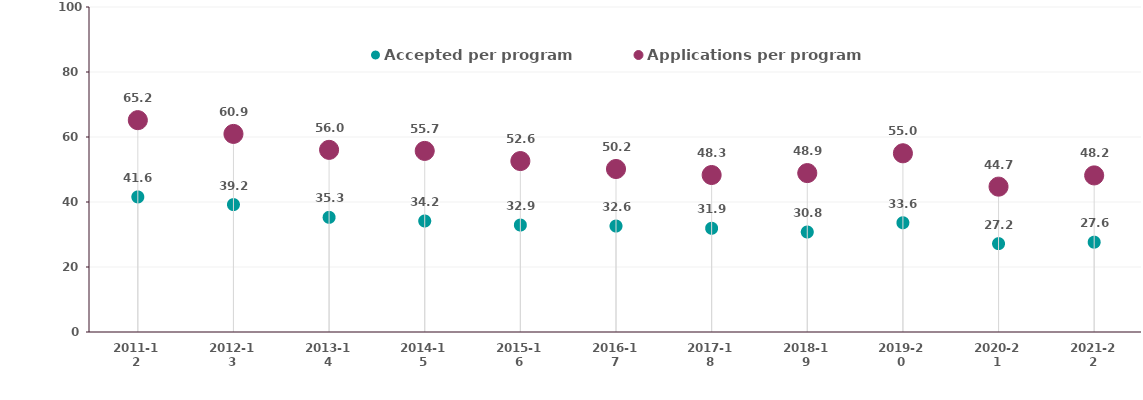
| Category | Accepted per program | Applications per program |
|---|---|---|
| 2011-12 | 41.557 | 65.181 |
| 2012-13 | 39.198 | 60.95 |
| 2013-14 | 35.275 | 56.044 |
| 2014-15 | 34.154 | 55.724 |
| 2015-16 | 32.909 | 52.597 |
| 2016-17 | 32.599 | 50.152 |
| 2017-18 | 31.913 | 48.304 |
| 2018-19 | 30.764 | 48.894 |
| 2019-20 | 33.612 | 54.992 |
| 2020-21 | 27.183 | 44.725 |
| 2021-22 | 27.63 | 48.183 |